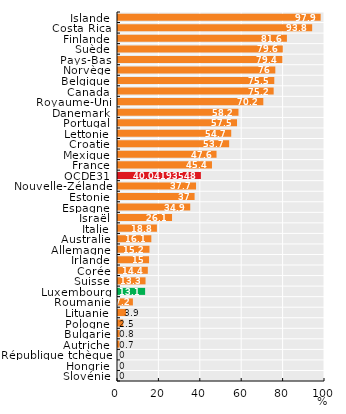
| Category | Series 0 |
|---|---|
| Islande | 97.9 |
| Costa Rica | 93.8 |
| Finlande | 81.6 |
| Suède | 79.6 |
| Pays-Bas | 79.4 |
| Norvège | 76 |
| Belgique | 75.5 |
| Canada | 75.2 |
| Royaume-Uni | 70.2 |
| Danemark | 58.2 |
| Portugal | 57.5 |
| Lettonie | 54.7 |
| Croatie | 53.7 |
| Mexique | 47.6 |
| France | 45.4 |
| OCDE31 | 40.042 |
| Nouvelle-Zélande | 37.7 |
| Estonie | 37 |
| Espagne | 34.9 |
| Israël | 26.1 |
| Italie | 18.8 |
| Australie | 16.1 |
| Allemagne | 15.2 |
| Irlande | 15 |
| Corée | 14.4 |
| Suisse | 13.3 |
| Luxembourg | 13.1 |
| Roumanie | 7.2 |
| Lituanie | 3.9 |
| Pologne | 2.5 |
| Bulgarie | 0.8 |
| Autriche | 0.7 |
| République tchèque | 0 |
| Hongrie | 0 |
| Slovénie | 0 |